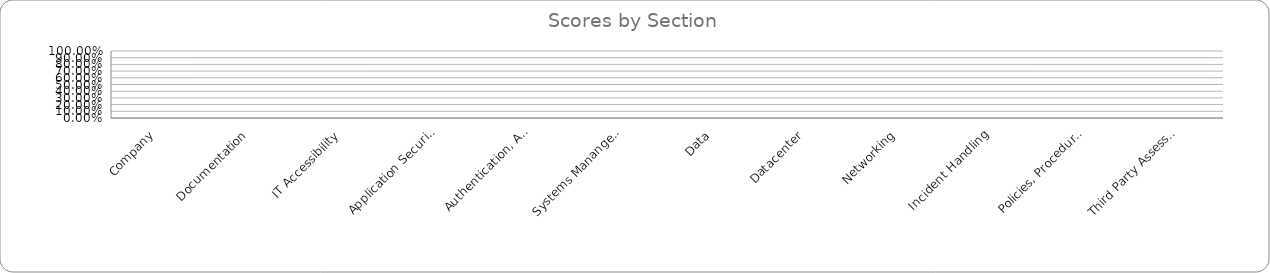
| Category | Series 0 |
|---|---|
| Company | 0 |
| Documentation | 0 |
| IT Accessibility | 0 |
| Application Security | 0 |
| Authentication, Authorization, and Accounting | 0 |
| Systems Manangement | 0 |
| Data | 0 |
| Datacenter | 0 |
| Networking | 0 |
| Incident Handling | 0 |
| Policies, Procedures, and Practices | 0 |
| Third Party Assessment | 0 |